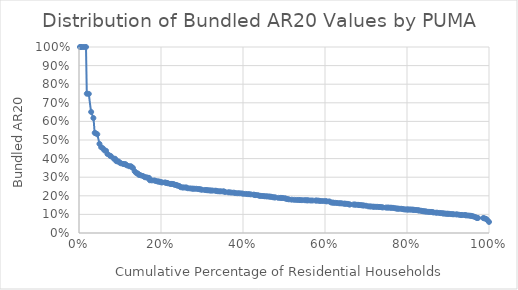
| Category | AR20_all |
|---|---|
| 0.00229714126138637 | 1 |
| 0.00495848922516532 | 1 |
| 0.00862710108444612 | 1 |
| 0.0128187682704769 | 1 |
| 0.0170727015459645 | 1 |
| 0.0190291510220477 | 0.749 |
| 0.0238782995773975 | 0.748 |
| 0.0297063076322547 | 0.651 |
| 0.0350762595945656 | 0.618 |
| 0.0383440826447197 | 0.538 |
| 0.0408165964471559 | 0.536 |
| 0.0446206809590504 | 0.531 |
| 0.0498993565976121 | 0.479 |
| 0.0540945051424997 | 0.461 |
| 0.0582927598258247 | 0.455 |
| 0.0620308367156017 | 0.444 |
| 0.0659784180145526 | 0.442 |
| 0.0693601036799676 | 0.425 |
| 0.0753371180315988 | 0.416 |
| 0.0780571603780205 | 0.413 |
| 0.0847012715413283 | 0.4 |
| 0.0881555069861986 | 0.399 |
| 0.0910147810875792 | 0.386 |
| 0.0933093078531898 | 0.386 |
| 0.0962643137095543 | 0.385 |
| 0.0986609710018259 | 0.379 |
| 0.101990874475696 | 0.375 |
| 0.107387090765171 | 0.371 |
| 0.110966066769101 | 0.37 |
| 0.113674534546957 | 0.37 |
| 0.116976335834573 | 0.364 |
| 0.122248436203648 | 0.359 |
| 0.126535249039316 | 0.359 |
| 0.128764240094245 | 0.355 |
| 0.131480951997997 | 0.35 |
| 0.13582396953546 | 0.332 |
| 0.139509005241157 | 0.323 |
| 0.143332614169711 | 0.32 |
| 0.145135206424111 | 0.314 |
| 0.147417198474968 | 0.312 |
| 0.150840330769191 | 0.31 |
| 0.155940582565616 | 0.306 |
| 0.160329619056677 | 0.3 |
| 0.163815697649296 | 0.299 |
| 0.166807125174218 | 0.297 |
| 0.170730455477818 | 0.297 |
| 0.172789036793163 | 0.284 |
| 0.177774202841279 | 0.283 |
| 0.183658722909273 | 0.283 |
| 0.187454455837116 | 0.279 |
| 0.191542680550682 | 0.278 |
| 0.193810602847556 | 0.277 |
| 0.196848488897398 | 0.276 |
| 0.200094497660822 | 0.273 |
| 0.202788618277436 | 0.272 |
| 0.209421669128128 | 0.272 |
| 0.212065299394471 | 0.27 |
| 0.214472634929714 | 0.269 |
| 0.217195608311697 | 0.267 |
| 0.222367402540128 | 0.264 |
| 0.225132646490052 | 0.264 |
| 0.228105959620993 | 0.264 |
| 0.231127697411031 | 0.262 |
| 0.23328291466111 | 0.259 |
| 0.236493666651025 | 0.258 |
| 0.239048846117338 | 0.256 |
| 0.240985783517392 | 0.255 |
| 0.244397838569002 | 0.253 |
| 0.247659685003799 | 0.246 |
| 0.252090327254303 | 0.245 |
| 0.254859155267074 | 0.245 |
| 0.25968689537642 | 0.245 |
| 0.262249648172253 | 0.244 |
| 0.265628613909155 | 0.241 |
| 0.271116875889052 | 0.24 |
| 0.275511813911807 | 0.238 |
| 0.278433010050162 | 0.238 |
| 0.281712261890211 | 0.238 |
| 0.286389771051551 | 0.238 |
| 0.290776160797457 | 0.236 |
| 0.294106039201292 | 0.235 |
| 0.296801568447245 | 0.234 |
| 0.299708163519016 | 0.233 |
| 0.306434065045054 | 0.231 |
| 0.309908533757169 | 0.231 |
| 0.312783327793923 | 0.23 |
| 0.316102825503731 | 0.23 |
| 0.319456154083125 | 0.229 |
| 0.322479555426976 | 0.228 |
| 0.325976747911879 | 0.228 |
| 0.332143854540746 | 0.227 |
| 0.334921793301108 | 0.227 |
| 0.337953484430958 | 0.225 |
| 0.342120845703689 | 0.224 |
| 0.345773347956857 | 0.224 |
| 0.350712773259537 | 0.224 |
| 0.353720566631959 | 0.224 |
| 0.356485365626997 | 0.22 |
| 0.363976247663599 | 0.219 |
| 0.367376089585932 | 0.219 |
| 0.371816178293565 | 0.217 |
| 0.377476223509105 | 0.217 |
| 0.380922148386969 | 0.215 |
| 0.38612827695169 | 0.214 |
| 0.390932003907304 | 0.214 |
| 0.396472733189329 | 0.213 |
| 0.400636383579212 | 0.211 |
| 0.406538997328018 | 0.21 |
| 0.410748650331516 | 0.209 |
| 0.414816698209209 | 0.209 |
| 0.418960455423919 | 0.208 |
| 0.425951500270248 | 0.206 |
| 0.428753530634814 | 0.204 |
| 0.430762855434077 | 0.204 |
| 0.435415198447688 | 0.204 |
| 0.439108191735243 | 0.201 |
| 0.441814909825222 | 0.2 |
| 0.445791171472479 | 0.199 |
| 0.449400746364129 | 0.199 |
| 0.452480700299889 | 0.198 |
| 0.456801300079649 | 0.197 |
| 0.459792971312565 | 0.197 |
| 0.46399423913515 | 0.196 |
| 0.4662609463146 | 0.195 |
| 0.469246328116018 | 0.195 |
| 0.473015342231626 | 0.192 |
| 0.476383475411267 | 0.192 |
| 0.479047278491892 | 0.191 |
| 0.486394000993043 | 0.189 |
| 0.491619223294392 | 0.189 |
| 0.493985090741786 | 0.188 |
| 0.49714194253633 | 0.188 |
| 0.501985138445141 | 0.187 |
| 0.504893929286267 | 0.185 |
| 0.50794368049326 | 0.182 |
| 0.511934804809614 | 0.181 |
| 0.518707922533771 | 0.179 |
| 0.52502453630759 | 0.178 |
| 0.530858393867372 | 0.178 |
| 0.535479580959846 | 0.178 |
| 0.539045289964672 | 0.177 |
| 0.543694739146599 | 0.177 |
| 0.549617106482777 | 0.177 |
| 0.553339958083006 | 0.176 |
| 0.556457653530818 | 0.176 |
| 0.558945002921759 | 0.176 |
| 0.564592175330047 | 0.175 |
| 0.569615232170472 | 0.175 |
| 0.577177948546409 | 0.174 |
| 0.579563362067943 | 0.174 |
| 0.583946663042515 | 0.174 |
| 0.587331700911743 | 0.172 |
| 0.591336432535976 | 0.172 |
| 0.596635061405972 | 0.172 |
| 0.601707835604959 | 0.172 |
| 0.604016493354597 | 0.17 |
| 0.610281201786366 | 0.17 |
| 0.614703401182302 | 0.164 |
| 0.618017201355697 | 0.164 |
| 0.620805979003678 | 0.163 |
| 0.624986656970658 | 0.162 |
| 0.629517254130353 | 0.161 |
| 0.634521575562705 | 0.16 |
| 0.637729465179754 | 0.16 |
| 0.641226492449224 | 0.159 |
| 0.646017169515138 | 0.158 |
| 0.648472590522178 | 0.157 |
| 0.65132461958341 | 0.157 |
| 0.655664969794973 | 0.156 |
| 0.658785104979164 | 0.154 |
| 0.661122025418318 | 0.153 |
| 0.669468067858998 | 0.153 |
| 0.672409654143108 | 0.153 |
| 0.67537792537694 | 0.152 |
| 0.680479061505463 | 0.152 |
| 0.683108723227144 | 0.15 |
| 0.68596943016282 | 0.15 |
| 0.689496919672 | 0.149 |
| 0.69220769860657 | 0.148 |
| 0.694958120659653 | 0.148 |
| 0.700098878612476 | 0.147 |
| 0.705597622635294 | 0.143 |
| 0.709403086619932 | 0.143 |
| 0.712936429234404 | 0.143 |
| 0.717286334891966 | 0.141 |
| 0.719836758357904 | 0.141 |
| 0.724151018134248 | 0.141 |
| 0.728154470143868 | 0.141 |
| 0.731754049804666 | 0.14 |
| 0.735048787197568 | 0.14 |
| 0.738470609336681 | 0.138 |
| 0.741249563988277 | 0.138 |
| 0.748371346860073 | 0.137 |
| 0.752375676169162 | 0.136 |
| 0.755082653948987 | 0.136 |
| 0.759649881297814 | 0.136 |
| 0.761929775791948 | 0.136 |
| 0.765644832979819 | 0.135 |
| 0.769290061319018 | 0.134 |
| 0.772917274714765 | 0.132 |
| 0.775558054610739 | 0.131 |
| 0.777951657667924 | 0.131 |
| 0.780886382386966 | 0.13 |
| 0.785851286384679 | 0.13 |
| 0.789675230983109 | 0.129 |
| 0.791964093750122 | 0.127 |
| 0.795798479580162 | 0.127 |
| 0.799134456463901 | 0.126 |
| 0.801974471228642 | 0.126 |
| 0.80373801671153 | 0.126 |
| 0.807335139412964 | 0.126 |
| 0.810518940966537 | 0.126 |
| 0.813601350483721 | 0.126 |
| 0.815584854273946 | 0.124 |
| 0.817995900412064 | 0.124 |
| 0.821918644909142 | 0.123 |
| 0.825271082005934 | 0.123 |
| 0.828004798863892 | 0.122 |
| 0.8303477128505 | 0.12 |
| 0.834401781908491 | 0.12 |
| 0.837264877386459 | 0.118 |
| 0.839599976803894 | 0.117 |
| 0.842741806023469 | 0.116 |
| 0.844975558841711 | 0.116 |
| 0.847953273592063 | 0.115 |
| 0.852422391317408 | 0.114 |
| 0.855078845285454 | 0.113 |
| 0.85874516584289 | 0.113 |
| 0.862099742129526 | 0.113 |
| 0.864693734804 | 0.11 |
| 0.870684885333386 | 0.109 |
| 0.874074835069737 | 0.109 |
| 0.879209450810906 | 0.108 |
| 0.882557473076392 | 0.107 |
| 0.886458988823755 | 0.106 |
| 0.888797330992293 | 0.105 |
| 0.891814861705757 | 0.105 |
| 0.895383415101483 | 0.104 |
| 0.89853058915598 | 0.103 |
| 0.900596500625692 | 0.103 |
| 0.903839803364725 | 0.103 |
| 0.907737462424631 | 0.102 |
| 0.911080549519479 | 0.101 |
| 0.914138996383313 | 0.101 |
| 0.919875554370388 | 0.1 |
| 0.923201311992264 | 0.1 |
| 0.928171799782837 | 0.098 |
| 0.931662410803741 | 0.097 |
| 0.934436950697011 | 0.097 |
| 0.939859035950479 | 0.096 |
| 0.942482689925245 | 0.096 |
| 0.944690374445207 | 0.095 |
| 0.9496121134947 | 0.094 |
| 0.953933748242382 | 0.093 |
| 0.956813873153846 | 0.092 |
| 0.959827974765809 | 0.091 |
| 0.963703144915441 | 0.088 |
| 0.968198089183162 | 0.084 |
| 0.970521112448647 | 0.081 |
| 0.973064126596681 | 0.081 |
| 0.985831298899417 | 0.081 |
| 0.988554148186907 | 0.079 |
| 0.992752735786349 | 0.076 |
| 0.996283839693862 | 0.069 |
| 1.0 | 0.059 |